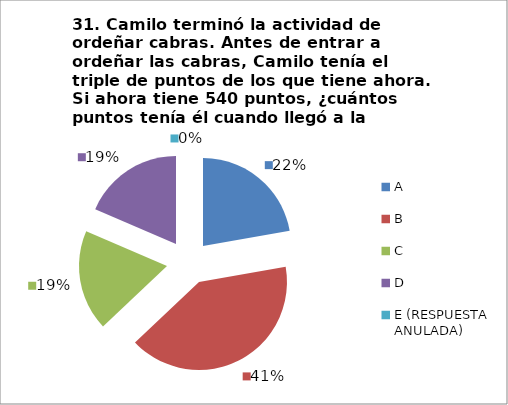
| Category | CANTIDAD DE RESPUESTAS PREGUNTA (31) | PORCENTAJE |
|---|---|---|
| A | 6 | 0.222 |
| B | 11 | 0.407 |
| C | 5 | 0.185 |
| D | 5 | 0.185 |
| E (RESPUESTA ANULADA) | 0 | 0 |